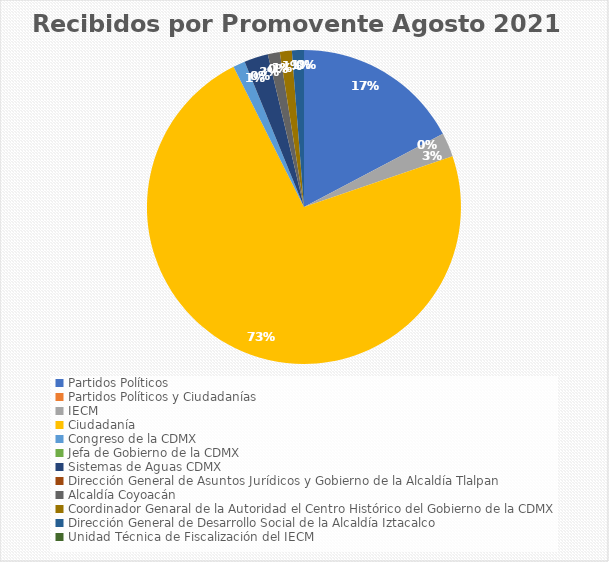
| Category | Recibidos por Promovente Agosto |
|---|---|
| Partidos Políticos | 14 |
| Partidos Políticos y Ciudadanías | 0 |
| IECM | 2 |
| Ciudadanía  | 59 |
| Congreso de la CDMX | 1 |
| Jefa de Gobierno de la CDMX | 0 |
| Sistemas de Aguas CDMX | 2 |
| Dirección General de Asuntos Jurídicos y Gobierno de la Alcaldía Tlalpan | 0 |
| Alcaldía Coyoacán | 1 |
| Coordinador Genaral de la Autoridad el Centro Histórico del Gobierno de la CDMX | 1 |
| Dirección General de Desarrollo Social de la Alcaldía Iztacalco | 1 |
| Unidad Técnica de Fiscalización del IECM | 0 |